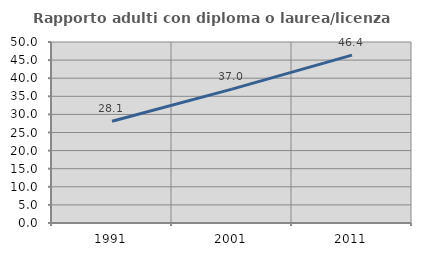
| Category | Rapporto adulti con diploma o laurea/licenza media  |
|---|---|
| 1991.0 | 28.09 |
| 2001.0 | 36.986 |
| 2011.0 | 46.379 |